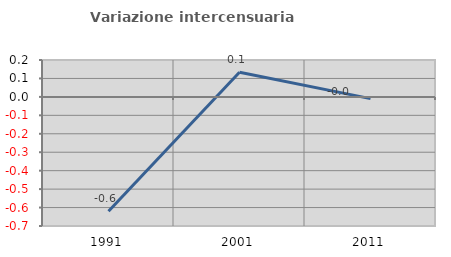
| Category | Variazione intercensuaria annua |
|---|---|
| 1991.0 | -0.62 |
| 2001.0 | 0.133 |
| 2011.0 | -0.009 |